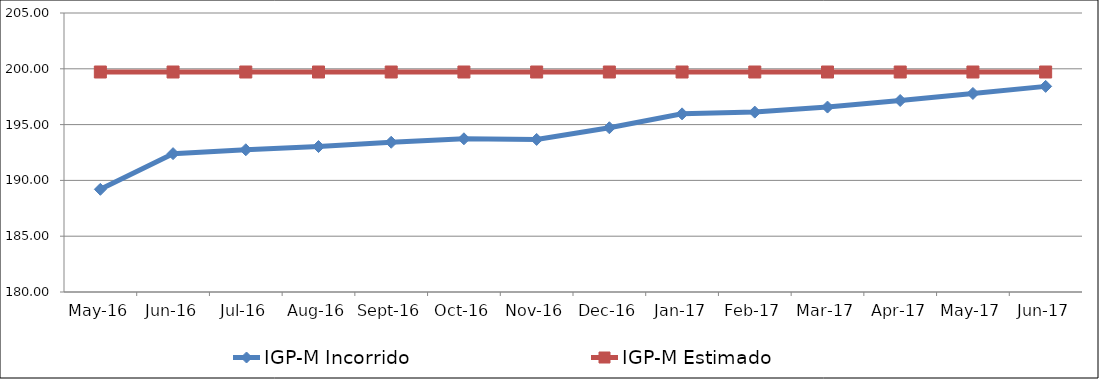
| Category | IGP-M Incorrido | IGP-M Estimado |
|---|---|---|
| 2016-05-01 | 189.201 | 199.712 |
| 2016-06-01 | 192.398 | 199.712 |
| 2016-07-01 | 192.744 | 199.712 |
| 2016-08-01 | 193.034 | 199.712 |
| 2016-09-01 | 193.42 | 199.712 |
| 2016-10-01 | 193.729 | 199.712 |
| 2016-11-01 | 193.671 | 199.712 |
| 2016-12-01 | 194.717 | 199.712 |
| 2017-01-01 | 195.963 | 199.712 |
| 2017-02-01 | 196.12 | 199.712 |
| 2017-03-01 | 196.571 | 199.712 |
| 2017-04-01 | 197.16 | 199.712 |
| 2017-05-01 | 197.791 | 199.712 |
| 2017-06-01 | 198.424 | 199.712 |